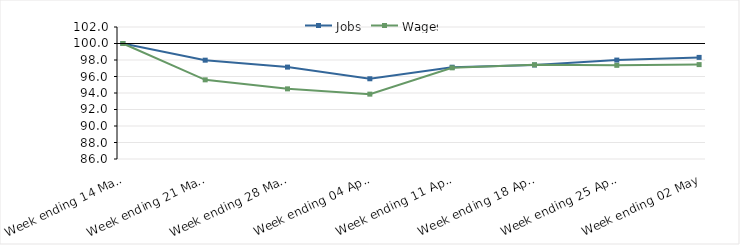
| Category | Jobs | Wages |
|---|---|---|
| 2020-03-14 | 100 | 100 |
| 2020-03-21 | 97.978 | 95.595 |
| 2020-03-28 | 97.139 | 94.501 |
| 2020-04-04 | 95.725 | 93.862 |
| 2020-04-11 | 97.126 | 97.051 |
| 2020-04-18 | 97.395 | 97.416 |
| 2020-04-25 | 97.991 | 97.354 |
| 2020-05-02 | 98.316 | 97.442 |